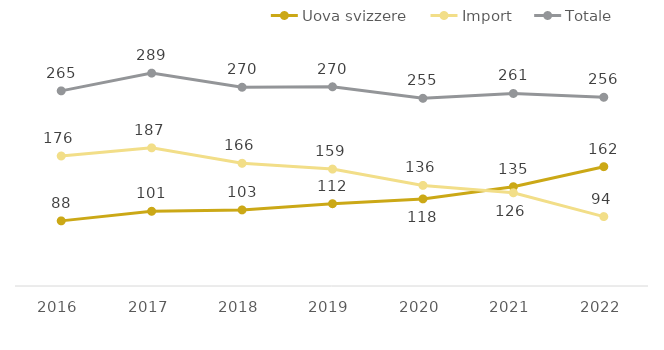
| Category | Uova svizzere | Import | Totale |
|---|---|---|---|
| 2016.0 | 88.351 | 176.361 | 264.712 |
| 2017.0 | 101.361 | 187.411 | 288.772 |
| 2018.0 | 103.198 | 166.436 | 269.634 |
| 2019.0 | 111.644 | 158.588 | 270.231 |
| 2020.0 | 118.144 | 136.475 | 254.619 |
| 2021.0 | 134.714 | 126.449 | 261.163 |
| 2022.0 | 161.877 | 94.164 | 256.041 |